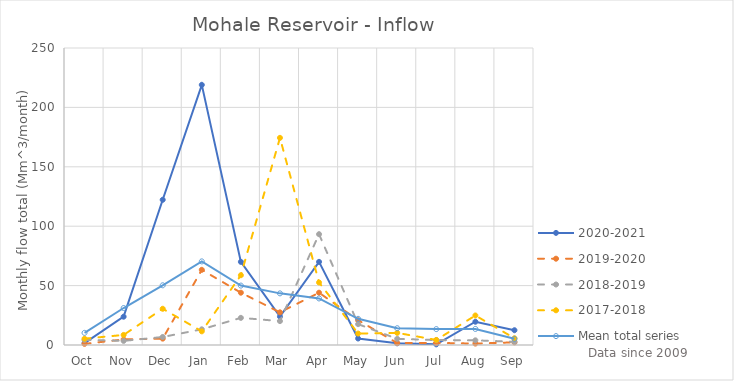
| Category | 2020-2021 | 2019-2020 | 2018-2019 | 2017-2018 | Mean total series |
|---|---|---|---|---|---|
| Oct | 1.621 | 0.951 | 4.329 | 5.326 | 10.217 |
| Nov | 23.834 | 4.683 | 3.48 | 8.477 | 31.121 |
| Dec | 122.226 | 5.364 | 6.746 | 30.5 | 50.26 |
| Jan | 218.961 | 63.283 | 13.19 | 11.5 | 70.377 |
| Feb | 69.983 | 44.026 | 22.848 | 58.721 | 50.006 |
| Mar | 23.869 | 27.494 | 20.124 | 174.371 | 43.462 |
| Apr | 69.983 | 44.026 | 93.274 | 52.628 | 39.183 |
| May | 5.459 | 20.863 | 17.548 | 9.652 | 22.014 |
| Jun | 1.418 | 1.651 | 5.205 | 10.214 | 14.115 |
| Jul | 0.539 | 1.776 | 4.136 | 4.26 | 13.383 |
| Aug | 19.577 | 1.207 | 3.93 | 24.846 | 13.519 |
| Sep | 12.441 | 2.228 | 2.702 | 5.688 | 5.191 |